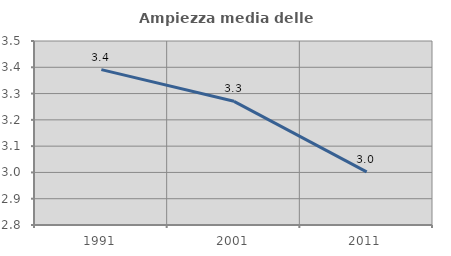
| Category | Ampiezza media delle famiglie |
|---|---|
| 1991.0 | 3.391 |
| 2001.0 | 3.271 |
| 2011.0 | 3.002 |